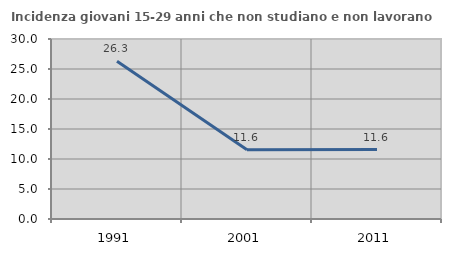
| Category | Incidenza giovani 15-29 anni che non studiano e non lavorano  |
|---|---|
| 1991.0 | 26.3 |
| 2001.0 | 11.55 |
| 2011.0 | 11.567 |